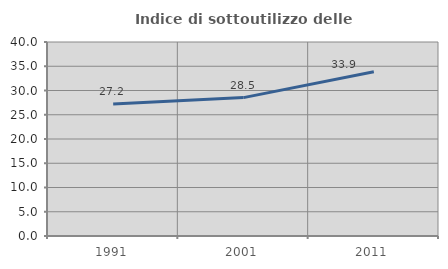
| Category | Indice di sottoutilizzo delle abitazioni  |
|---|---|
| 1991.0 | 27.207 |
| 2001.0 | 28.532 |
| 2011.0 | 33.867 |